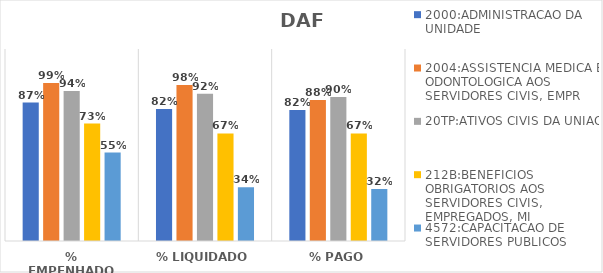
| Category | 2000:ADMINISTRACAO DA UNIDADE | 2004:ASSISTENCIA MEDICA E ODONTOLOGICA AOS SERVIDORES CIVIS, EMPR | 20TP:ATIVOS CIVIS DA UNIAO | 212B:BENEFICIOS OBRIGATORIOS AOS SERVIDORES CIVIS, EMPREGADOS, MI | 4572:CAPACITACAO DE SERVIDORES PUBLICOS FEDERAIS EM PROCESSO DE Q |
|---|---|---|---|---|---|
| % EMPENHADO | 0.866 | 0.987 | 0.938 | 0.734 | 0.552 |
| % LIQUIDADO | 0.825 | 0.975 | 0.92 | 0.672 | 0.337 |
| % PAGO | 0.819 | 0.881 | 0.9 | 0.672 | 0.325 |